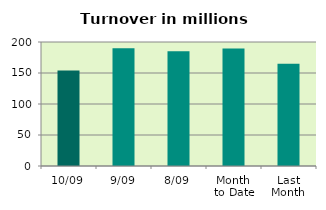
| Category | Series 0 |
|---|---|
| 10/09 | 153.934 |
| 9/09 | 189.802 |
| 8/09 | 185.253 |
| Month 
to Date | 189.613 |
| Last
Month | 165.075 |